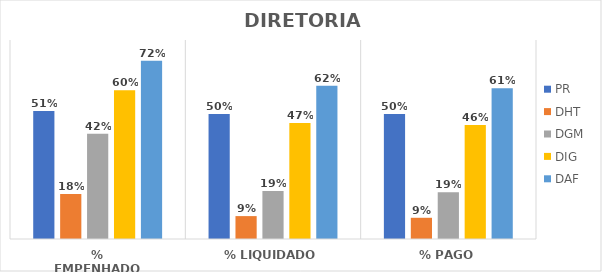
| Category | PR | DHT | DGM | DIG | DAF |
|---|---|---|---|---|---|
| % EMPENHADO | 0.515 | 0.181 | 0.423 | 0.598 | 0.717 |
| % LIQUIDADO | 0.503 | 0.092 | 0.193 | 0.466 | 0.617 |
| % PAGO | 0.503 | 0.085 | 0.188 | 0.459 | 0.606 |